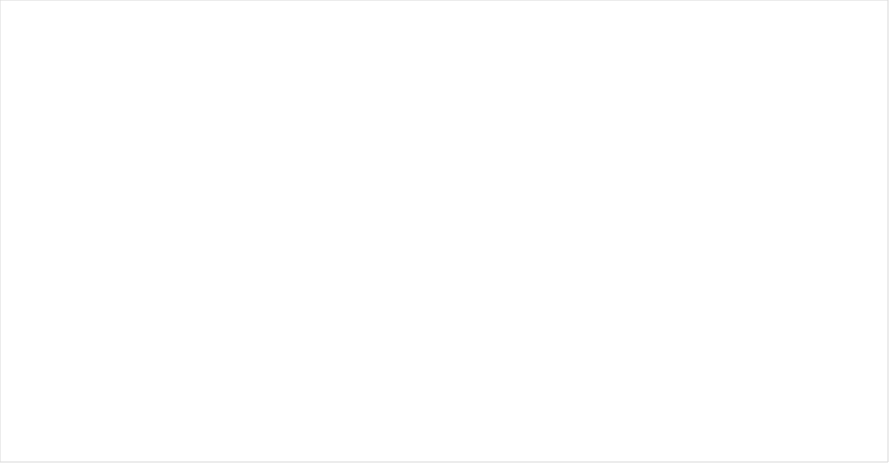
| Category |  APROPIACION
 VIGENTE |  COMPROMISOS
 ACUMULADOS |  OBLIGACIONES
 ACUMULADAS |  PAGOS
 ACUMULADOS |
|---|---|---|---|---|
| A-01 -GASTOS DE PERSONAL | 51464.345 | 18923.726 | 18923.726 | 17986.571 |
| A-02 -ADQUISICIÓN DE BIENES  Y SERVICIOS | 19419.071 | 14850.802 | 6864.928 | 6655.35 |
| A-03-TRANSFERENCIAS CORRIENTES | 14851.097 | 51.17 | 51.17 | 51.17 |
| A-08-GASTOS POR TRIBUTOS, MULTAS, SANCIONES E INTERESES DE MORA | 14051.472 | 0 | 0 | 0 |